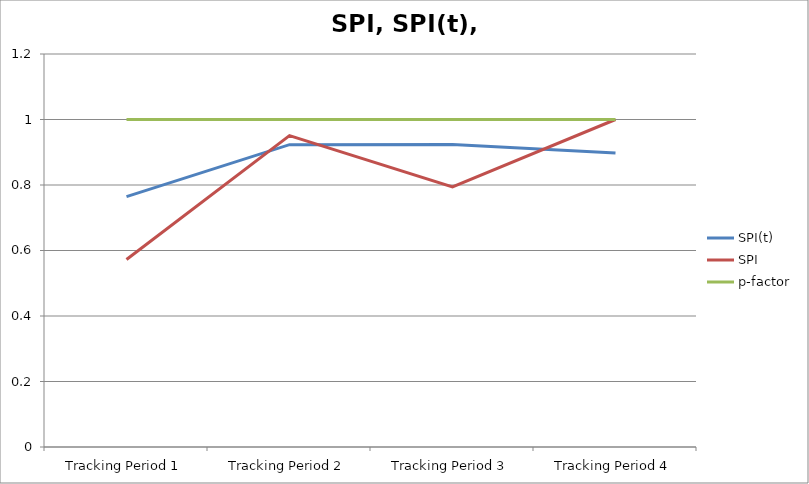
| Category | SPI(t) | SPI | p-factor |
|---|---|---|---|
| Tracking Period 1 | 0.765 | 0.572 | 1 |
| Tracking Period 2 | 0.923 | 0.951 | 1 |
| Tracking Period 3 | 0.924 | 0.794 | 1 |
| Tracking Period 4 | 0.897 | 1 | 1 |